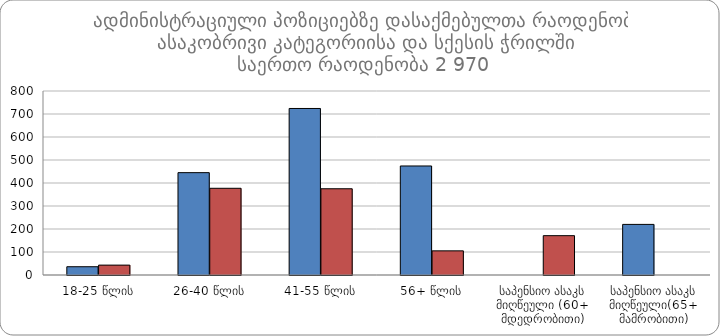
| Category |  მამრობითი	 | მდედრობითი |
|---|---|---|
| 18-25 წლის | 36 | 43 |
| 26-40 წლის | 445 | 377 |
| 41-55 წლის | 724 | 375 |
| 56+ წლის | 474 | 105 |
| საპენსიო ასაკს მიღწეული (60+ მდედრობითი) | 0 | 171 |
| საპენსიო ასაკს მიღწეული(65+ მამრობითი) | 220 | 0 |